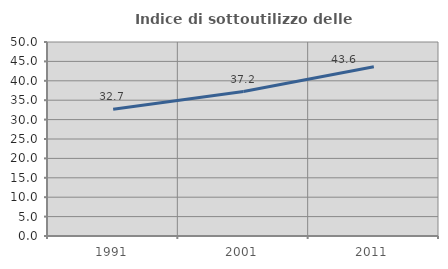
| Category | Indice di sottoutilizzo delle abitazioni  |
|---|---|
| 1991.0 | 32.676 |
| 2001.0 | 37.24 |
| 2011.0 | 43.622 |